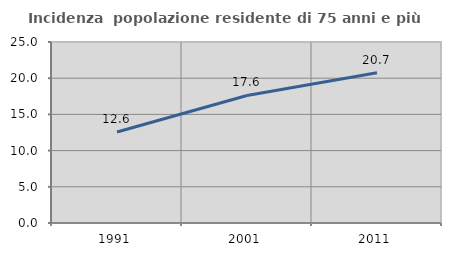
| Category | Incidenza  popolazione residente di 75 anni e più |
|---|---|
| 1991.0 | 12.579 |
| 2001.0 | 17.614 |
| 2011.0 | 20.743 |